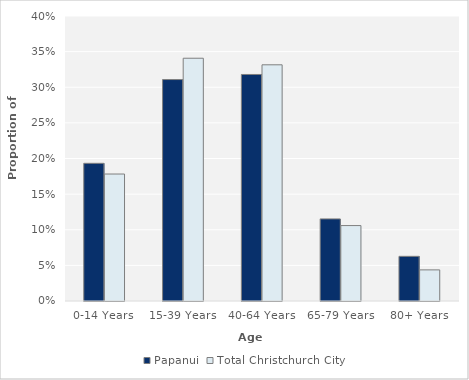
| Category | Papanui | Total Christchurch City |
|---|---|---|
| 0-14 Years | 0.193 | 0.178 |
| 15-39 Years | 0.311 | 0.341 |
| 40-64 Years | 0.318 | 0.331 |
| 65-79 Years | 0.115 | 0.106 |
| 80+ Years | 0.063 | 0.044 |